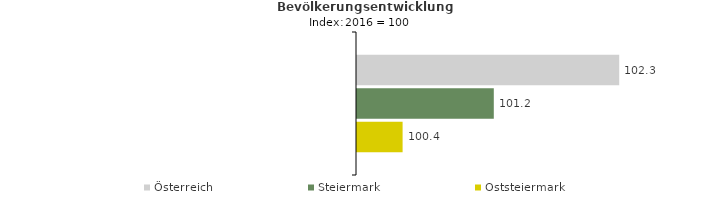
| Category | Österreich | Steiermark | Oststeiermark |
|---|---|---|---|
| 2020.0 | 102.3 | 101.2 | 100.4 |